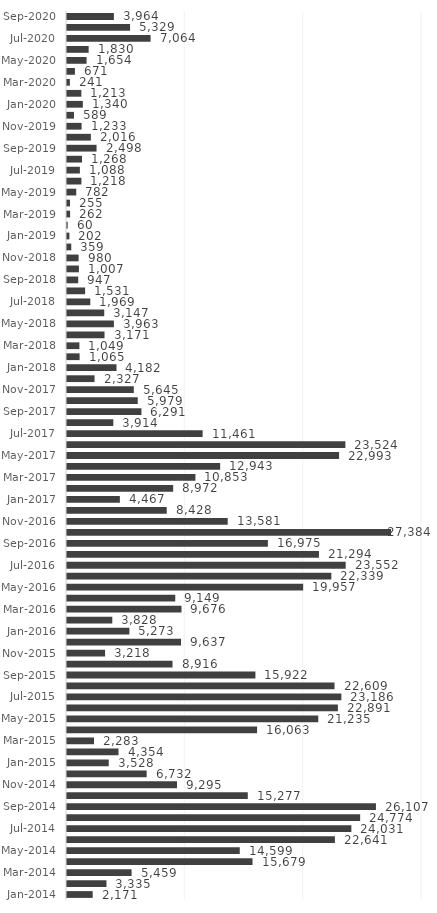
| Category | Series 0 |
|---|---|
| Jan-2014 | 2171 |
| Feb-2014 | 3335 |
| Mar-2014 | 5459 |
| Apr-2014 | 15679 |
| May-2014 | 14599 |
| Jun-2014 | 22641 |
| Jul-2014 | 24031 |
| Aug-2014 | 24774 |
| Sep-2014 | 26107 |
| Oct-2014 | 15277 |
| Nov-2014 | 9295 |
| Dec-2014 | 6732 |
| Jan-2015 | 3528 |
| Feb-2015 | 4354 |
| Mar-2015 | 2283 |
| Apr-2015 | 16063 |
| May-2015 | 21235 |
| Jun-2015 | 22891 |
| Jul-2015 | 23186 |
| Aug-2015 | 22609 |
| Sep-2015 | 15922 |
| Oct-2015 | 8916 |
| Nov-2015 | 3218 |
| Dec-2015 | 9637 |
| Jan-2016 | 5273 |
| Feb-2016 | 3828 |
| Mar-2016 | 9676 |
| Apr-2016 | 9149 |
| May-2016 | 19957 |
| Jun-2016 | 22339 |
| Jul-2016 | 23552 |
| Aug-2016 | 21294 |
| Sep-2016 | 16975 |
| Oct-2016 | 27384 |
| Nov-2016 | 13581 |
| Dec-2016 | 8428 |
| Jan-2017 | 4467 |
| Feb-2017 | 8972 |
| Mar-2017 | 10853 |
| Apr-2017 | 12943 |
| May-2017 | 22993 |
| Jun-2017 | 23524 |
| Jul-2017 | 11461 |
| Aug-2017 | 3914 |
| Sep-2017 | 6291 |
| Oct-2017 | 5979 |
| Nov-2017 | 5645 |
| Dec-2017 | 2327 |
| Jan-2018 | 4182 |
| Feb-2018 | 1065 |
| Mar-2018 | 1049 |
| Apr-2018 | 3171 |
| May-2018 | 3963 |
| Jun-2018 | 3147 |
| Jul-2018 | 1969 |
| Aug-2018 | 1531 |
| Sep-2018 | 947 |
| Oct-2018 | 1007 |
| Nov-2018 | 980 |
| Dec-2018 | 359 |
| Jan-2019 | 202 |
| Feb-2019 | 60 |
| Mar-2019 | 262 |
| Apr-2019 | 255 |
| May-2019 | 782 |
| Jun-2019 | 1218 |
| Jul-2019 | 1088 |
| Aug-2019 | 1268 |
| Sep-2019 | 2498 |
| Oct-2019 | 2016 |
| Nov-2019 | 1233 |
| Dec-2019 | 589 |
| Jan-2020 | 1340 |
| Feb-2020 | 1213 |
| Mar-2020 | 241 |
| Apr-2020 | 671 |
| May-2020 | 1654 |
| Jun-2020 | 1830 |
| Jul-2020 | 7064 |
| Aug-2020 | 5329 |
| Sep-2020 | 3964 |